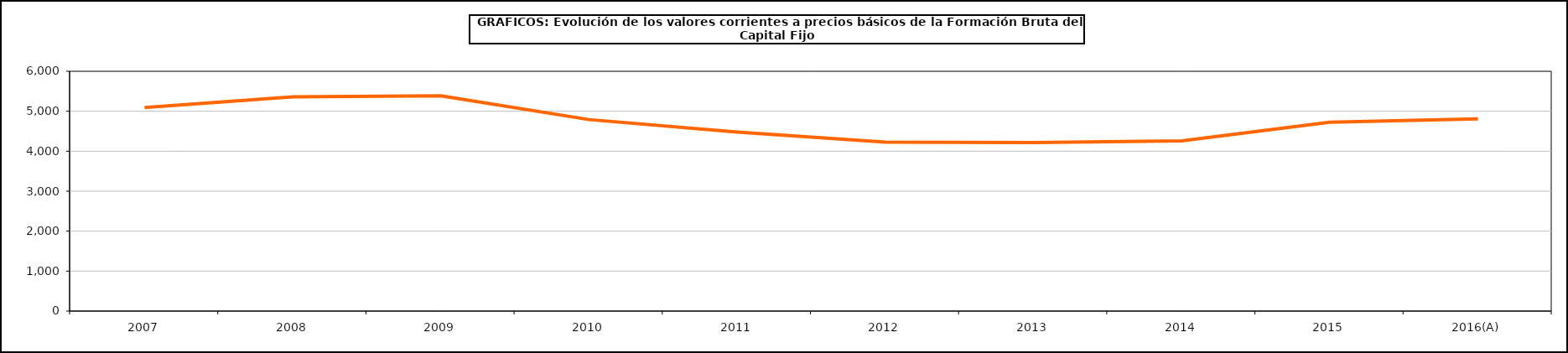
| Category | Formación bruta del capital fijo |
|---|---|
| 2007 | 5090.144 |
| 2008 | 5357.826 |
| 2009 | 5388.076 |
| 2010 | 4791.081 |
| 2011 | 4479.051 |
| 2012 | 4225.823 |
| 2013 | 4219.26 |
| 2014 | 4259.146 |
| 2015 | 4723.048 |
| 2016(A) | 4808.945 |